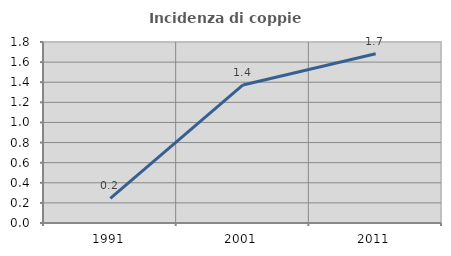
| Category | Incidenza di coppie miste |
|---|---|
| 1991.0 | 0.244 |
| 2001.0 | 1.373 |
| 2011.0 | 1.683 |